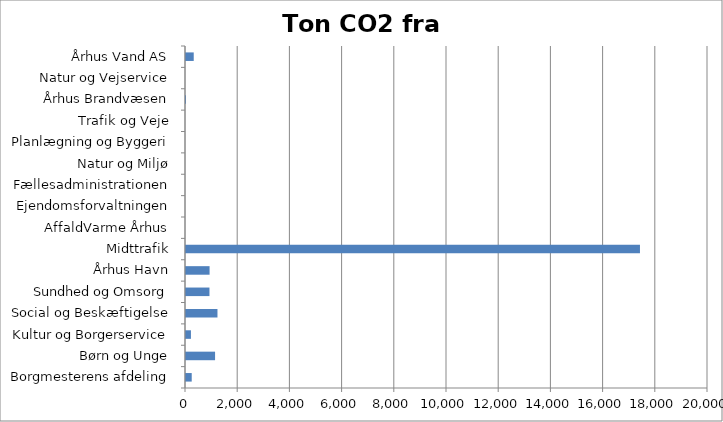
| Category | Ton CO2 |
|---|---|
| Borgmesterens afdeling | 219.07 |
| Børn og Unge | 1113.805 |
| Kultur og Borgerservice | 189.207 |
| Social og Beskæftigelse | 1205.418 |
| Sundhed og Omsorg | 899.012 |
| Århus Havn | 903.532 |
| Midttrafik | 17393.148 |
| AffaldVarme Århus | 0 |
| Ejendomsforvaltningen | 0 |
| Fællesadministrationen | 0 |
| Natur og Miljø | 0 |
| Planlægning og Byggeri | 0 |
| Trafik og Veje | 0 |
| Århus Brandvæsen | 0.061 |
| Natur og Vejservice | 0 |
| Århus Vand AS | 296.119 |